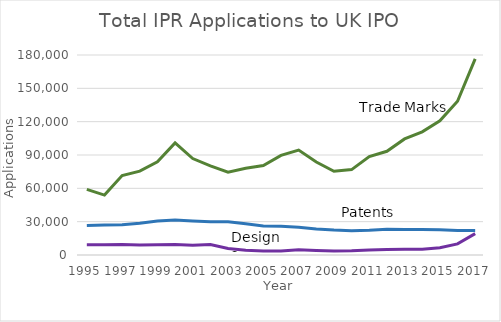
| Category | Patents | TM | Designs |
|---|---|---|---|
| 0 | 26624 | 59053 | 9246 |
| 1 | 27050 | 53913 | 9293 |
| 2 | 27244 | 71463 | 9528 |
| 3 | 28646 | 75461 | 9027 |
| 4 | 30510 | 83942 | 9227 |
| 5 | 31444 | 100907 | 9380 |
| 6 | 30622 | 86837 | 8697 |
| 7 | 29950 | 80268 | 9512 |
| 8 | 29851 | 74495 | 5910 |
| 9 | 28223 | 78104 | 4175 |
| 10 | 26210 | 80543 | 3588 |
| 11 | 25771 | 89676 | 3495 |
| 12 | 25037 | 94473 | 4683 |
| 13 | 23396 | 83685 | 4037 |
| 14 | 22470 | 75368 | 3523 |
| 15 | 21928 | 76856 | 3793 |
| 16 | 22260 | 88634 | 4492 |
| 17 | 23232 | 93361 | 4905 |
| 18 | 22966 | 104443 | 5186 |
| 19 | 23034 | 110838 | 5084 |
| 20 | 22811 | 120792 | 6472 |
| 21 | 22057 | 138409 | 10030 |
| 22 | 22074 | 176493 | 19269 |